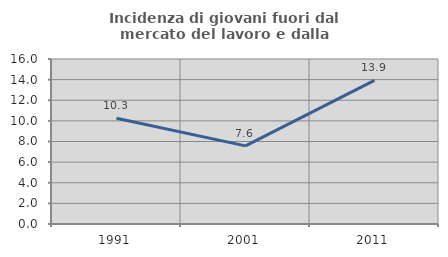
| Category | Incidenza di giovani fuori dal mercato del lavoro e dalla formazione  |
|---|---|
| 1991.0 | 10.254 |
| 2001.0 | 7.574 |
| 2011.0 | 13.934 |